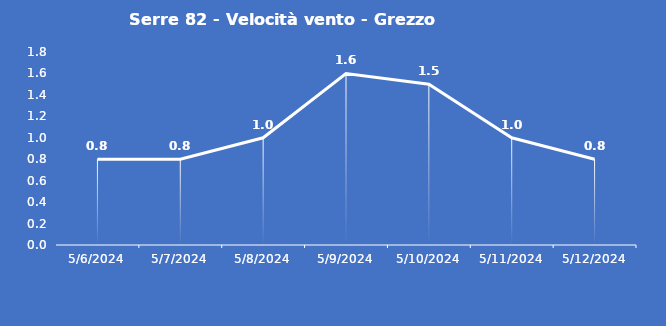
| Category | Serre 82 - Velocità vento - Grezzo (m/s) |
|---|---|
| 5/6/24 | 0.8 |
| 5/7/24 | 0.8 |
| 5/8/24 | 1 |
| 5/9/24 | 1.6 |
| 5/10/24 | 1.5 |
| 5/11/24 | 1 |
| 5/12/24 | 0.8 |